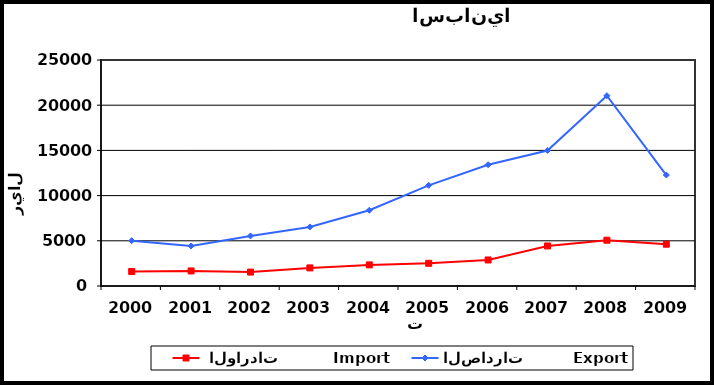
| Category |  الواردات           Import | الصادرات          Export |
|---|---|---|
| 2000.0 | 1607 | 5013 |
| 2001.0 | 1666 | 4428 |
| 2002.0 | 1540 | 5539 |
| 2003.0 | 2003 | 6536 |
| 2004.0 | 2336 | 8382 |
| 2005.0 | 2510 | 11134 |
| 2006.0 | 2880 | 13417 |
| 2007.0 | 4429 | 14990 |
| 2008.0 | 5064 | 21049 |
| 2009.0 | 4623 | 12274 |